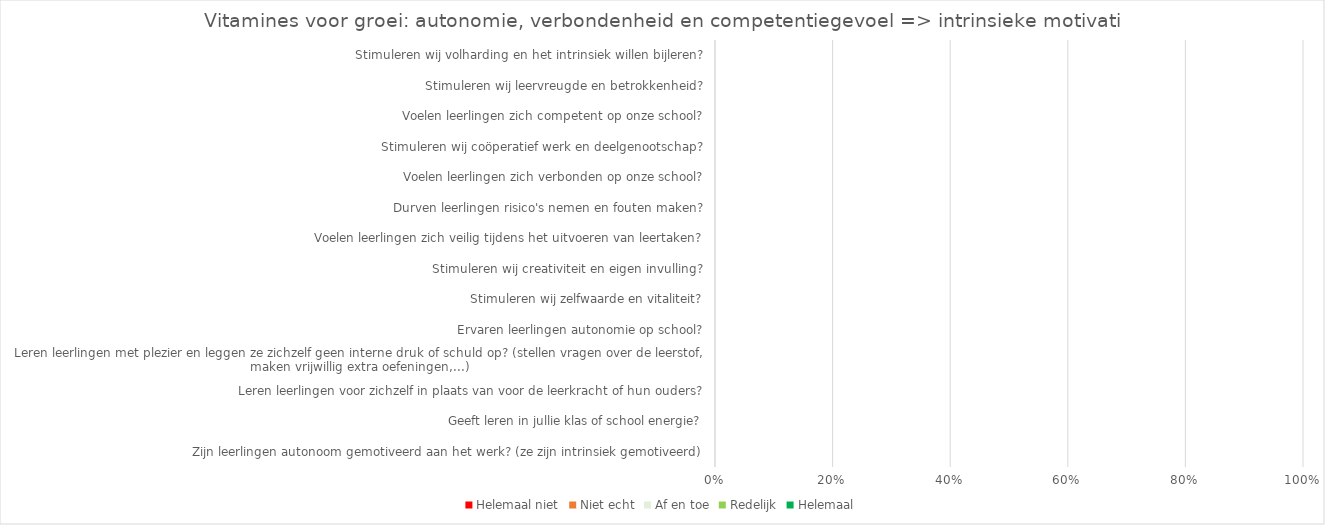
| Category | Helemaal niet | Niet echt | Af en toe | Redelijk | Helemaal |
|---|---|---|---|---|---|
| Zijn leerlingen autonoom gemotiveerd aan het werk? (ze zijn intrinsiek gemotiveerd) | 0 | 0 | 0 | 0 | 0 |
| Geeft leren in jullie klas of school energie? | 0 | 0 | 0 | 0 | 0 |
| Leren leerlingen voor zichzelf in plaats van voor de leerkracht of hun ouders? | 0 | 0 | 0 | 0 | 0 |
| Leren leerlingen met plezier en leggen ze zichzelf geen interne druk of schuld op? (stellen vragen over de leerstof, maken vrijwillig extra oefeningen,...) | 0 | 0 | 0 | 0 | 0 |
| Ervaren leerlingen autonomie op school? | 0 | 0 | 0 | 0 | 0 |
| Stimuleren wij zelfwaarde en vitaliteit? | 0 | 0 | 0 | 0 | 0 |
| Stimuleren wij creativiteit en eigen invulling? | 0 | 0 | 0 | 0 | 0 |
| Voelen leerlingen zich veilig tijdens het uitvoeren van leertaken? | 0 | 0 | 0 | 0 | 0 |
| Durven leerlingen risico's nemen en fouten maken? | 0 | 0 | 0 | 0 | 0 |
| Voelen leerlingen zich verbonden op onze school? | 0 | 0 | 0 | 0 | 0 |
| Stimuleren wij coöperatief werk en deelgenootschap? | 0 | 0 | 0 | 0 | 0 |
| Voelen leerlingen zich competent op onze school? | 0 | 0 | 0 | 0 | 0 |
| Stimuleren wij leervreugde en betrokkenheid? | 0 | 0 | 0 | 0 | 0 |
| Stimuleren wij volharding en het intrinsiek willen bijleren? | 0 | 0 | 0 | 0 | 0 |